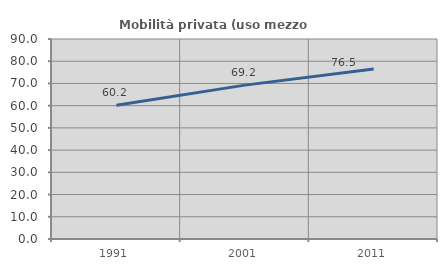
| Category | Mobilità privata (uso mezzo privato) |
|---|---|
| 1991.0 | 60.154 |
| 2001.0 | 69.245 |
| 2011.0 | 76.477 |